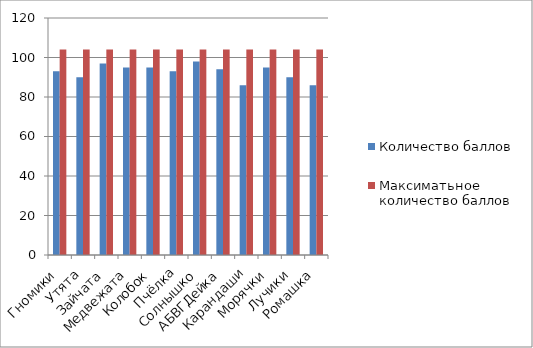
| Category | Количество баллов | Максиматьное количество баллов |
|---|---|---|
| Гномики | 93 | 104 |
| Утята | 90 | 104 |
| Зайчата | 97 | 104 |
| Медвежата | 95 | 104 |
| Колобок | 95 | 104 |
| Пчёлка | 93 | 104 |
| Солнышко | 98 | 104 |
| АБВГДейка | 94 | 104 |
| Карандаши | 86 | 104 |
| Морячки | 95 | 104 |
| Лучики | 90 | 104 |
| Ромашка | 86 | 104 |